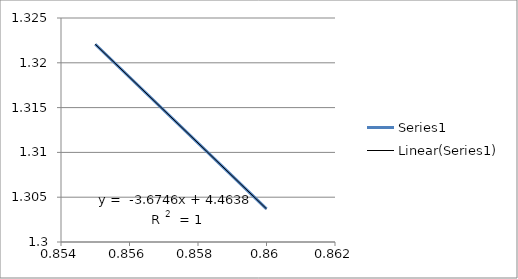
| Category | Series 0 |
|---|---|
| 0.86 | 1.304 |
| 0.855 | 1.322 |